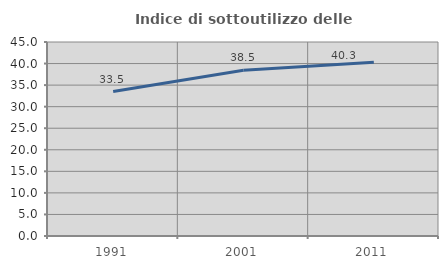
| Category | Indice di sottoutilizzo delle abitazioni  |
|---|---|
| 1991.0 | 33.501 |
| 2001.0 | 38.462 |
| 2011.0 | 40.299 |